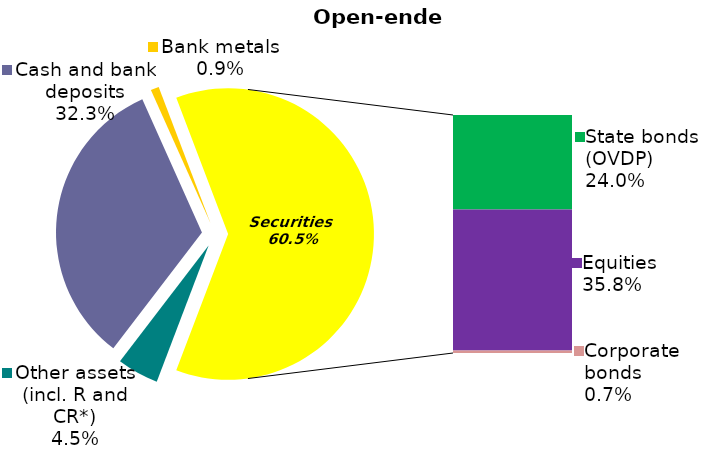
| Category | Series 0 |
|---|---|
| Other assets (incl. R and CR*) | 0.045 |
| Cash and bank deposits | 0.323 |
| Bank metals | 0.009 |
| State bonds (OVDP) | 0.24 |
| Equities | 0.358 |
| Corporate bonds | 0.007 |